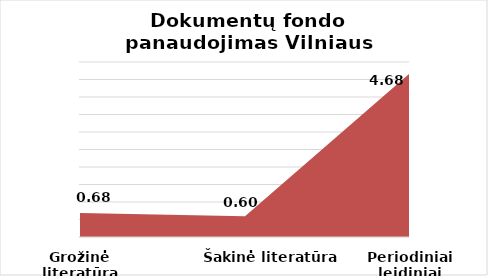
| Category | Series 0 |
|---|---|
| Grožinė literatūra | 0.685 |
| Šakinė literatūra | 0.596 |
| Periodiniai leidiniai | 4.681 |